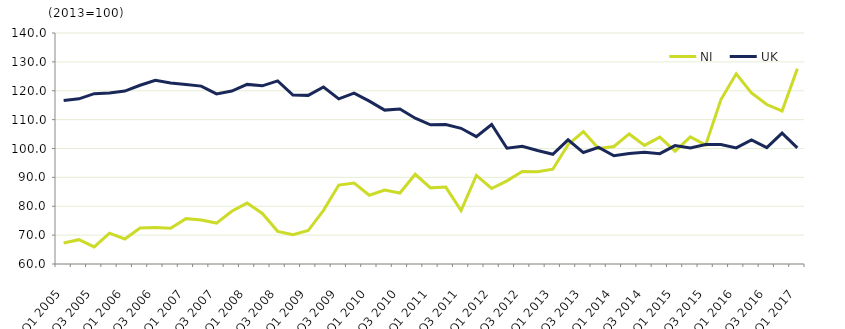
| Category | NI  | UK  |
|---|---|---|
| Q1 2005 | 67.29 | 116.6 |
| Q2 2005 | 68.426 | 117.2 |
| Q3 2005 | 65.91 | 119 |
| Q4 2005 | 70.663 | 119.2 |
| Q1 2006 | 68.661 | 119.9 |
| Q2 2006 | 72.495 | 121.9 |
| Q3 2006 | 72.601 | 123.6 |
| Q4 2006 | 72.361 | 122.7 |
| Q1 2007 | 75.706 | 122.2 |
| Q2 2007 | 75.225 | 121.6 |
| Q3 2007 | 74.169 | 118.9 |
| Q4 2007 | 78.27 | 119.9 |
| Q1 2008 | 81.096 | 122.2 |
| Q2 2008 | 77.5 | 121.7 |
| Q3 2008 | 71.31 | 123.4 |
| Q4 2008 | 70.178 | 118.5 |
| Q1 2009 | 71.585 | 118.4 |
| Q2 2009 | 78.602 | 121.3 |
| Q3 2009 | 87.343 | 117.2 |
| Q4 2009 | 88.04 | 119.2 |
| Q1 2010 | 83.809 | 116.4 |
| Q2 2010 | 85.603 | 113.3 |
| Q3 2010 | 84.573 | 113.7 |
| Q4 2010 | 91.079 | 110.5 |
| Q1 2011 | 86.365 | 108.2 |
| Q2 2011 | 86.624 | 108.3 |
| Q3 2011 | 78.491 | 107 |
| Q4 2011 | 90.656 | 104.1 |
| Q1 2012 | 86.144 | 108.3 |
| Q2 2012 | 88.787 | 100.1 |
| Q3 2012 | 92.019 | 100.8 |
| Q4 2012 | 91.985 | 99.3 |
| Q1 2013 | 92.827 | 98 |
| Q2 2013 | 101.321 | 103 |
| Q3 2013 | 105.884 | 98.6 |
| Q4 2013 | 99.969 | 100.4 |
| Q1 2014 | 100.685 | 97.5 |
| Q2 2014 | 105.039 | 98.3 |
| Q3 2014 | 101.088 | 98.7 |
| Q4 2014 | 103.952 | 98.2 |
| Q1 2015 | 99.092 | 101 |
| Q2 2015 | 104.011 | 100.2 |
| Q3 2015 | 101.167 | 101.4 |
| Q4 2015 | 116.953 | 101.4 |
| Q1 2016 | 125.866 | 100.2 |
| Q2 2016 | 119.214 | 103 |
| Q3 2016 | 115.222 | 100.3 |
| Q4 2016 | 113.007 | 105.3 |
| Q1 2017 | 127.582 | 100.2 |